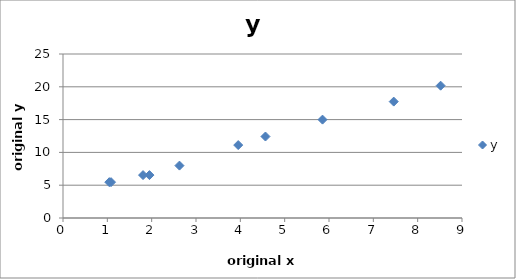
| Category | y |
|---|---|
| 1.9499382828179357 | 6.539 |
| 7.459932029410997 | 17.744 |
| 1.805598053889771 | 6.541 |
| 8.517985361607321 | 20.171 |
| 1.0837518591015998 | 5.465 |
| 5.853784585691642 | 14.997 |
| 3.952008543630895 | 11.118 |
| 4.566973330330322 | 12.42 |
| 2.626991754130744 | 7.989 |
| 1.044156037513153 | 5.463 |